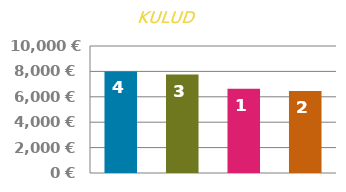
| Category | KOHENE |
|---|---|
| 0 | 8000 |
| 1 | 7750 |
| 2 | 6625 |
| 3 | 6450 |